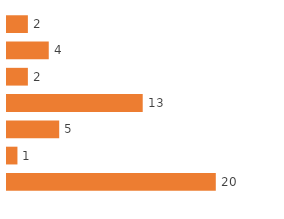
| Category | Total |
|---|---|
| White | 20 |
| Native Hawaiian / Pacific Islander | 1 |
| Multiple race | 5 |
| Hispanic/Latino(a) or Spanish origin | 13 |
| Chinese | 2 |
| Black/African American | 4 |
| American Indian/Alaskan Native | 2 |